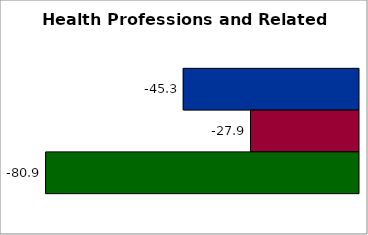
| Category | 50 states and D.C. | SREB states | State |
|---|---|---|---|
| 0 | -45.323 | -27.924 | -80.916 |